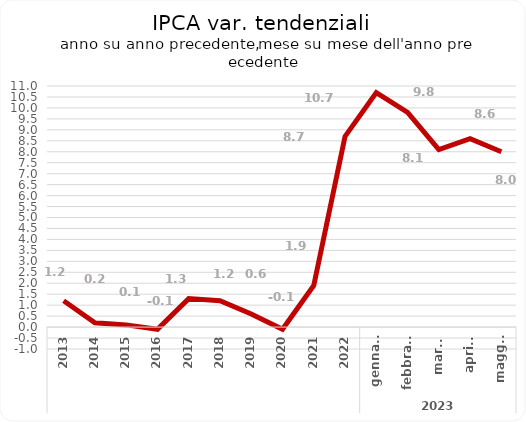
| Category | IPCA var. tendenziali |
|---|---|
| 0 | 1.2 |
| 1 | 0.2 |
| 2 | 0.1 |
| 3 | -0.1 |
| 4 | 1.3 |
| 5 | 1.2 |
| 6 | 0.6 |
| 7 | -0.1 |
| 8 | 1.9 |
| 9 | 8.7 |
| 10 | 10.7 |
| 11 | 9.8 |
| 12 | 8.1 |
| 13 | 8.6 |
| 14 | 8 |